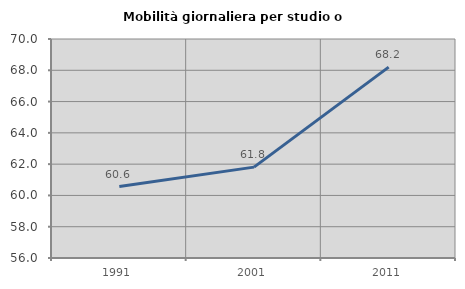
| Category | Mobilità giornaliera per studio o lavoro |
|---|---|
| 1991.0 | 60.564 |
| 2001.0 | 61.809 |
| 2011.0 | 68.2 |